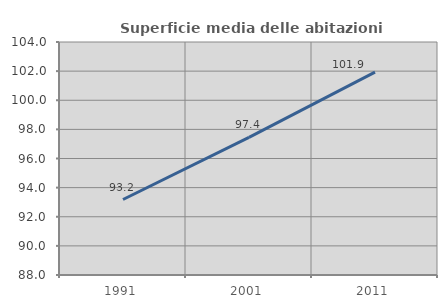
| Category | Superficie media delle abitazioni occupate |
|---|---|
| 1991.0 | 93.184 |
| 2001.0 | 97.446 |
| 2011.0 | 101.935 |